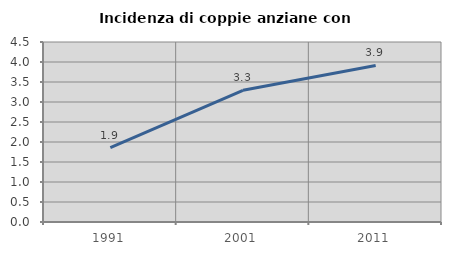
| Category | Incidenza di coppie anziane con figli |
|---|---|
| 1991.0 | 1.86 |
| 2001.0 | 3.292 |
| 2011.0 | 3.915 |